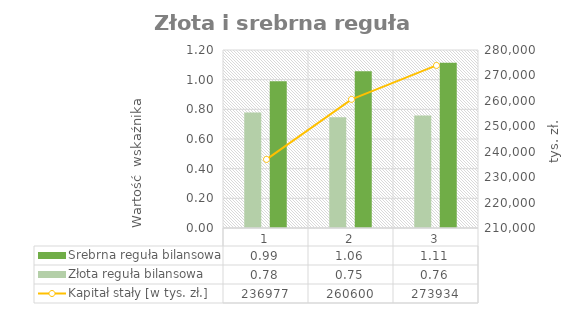
| Category | Złota reguła bilansowa | Srebrna reguła bilansowa |
|---|---|---|
| 0 | 0.779 | 0.99 |
| 1 | 0.747 | 1.057 |
| 2 | 0.759 | 1.113 |